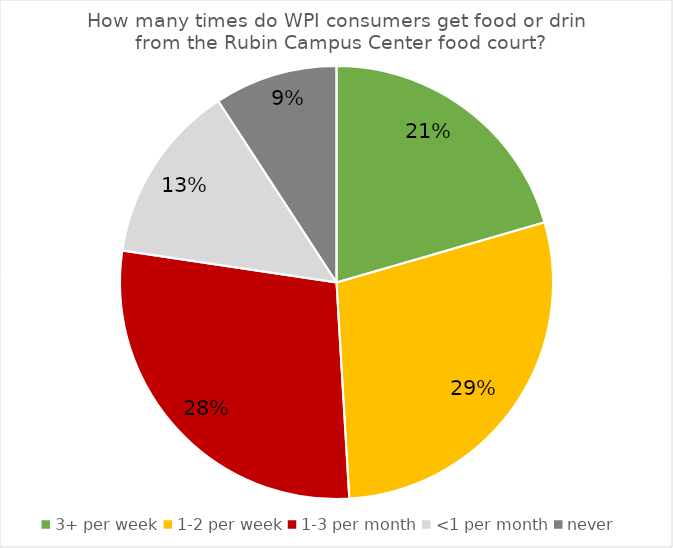
| Category | Series 0 |
|---|---|
| 3+ per week | 87 |
| 1-2 per week | 121 |
| 1-3 per month | 120 |
| <1 per month | 57 |
| never | 39 |